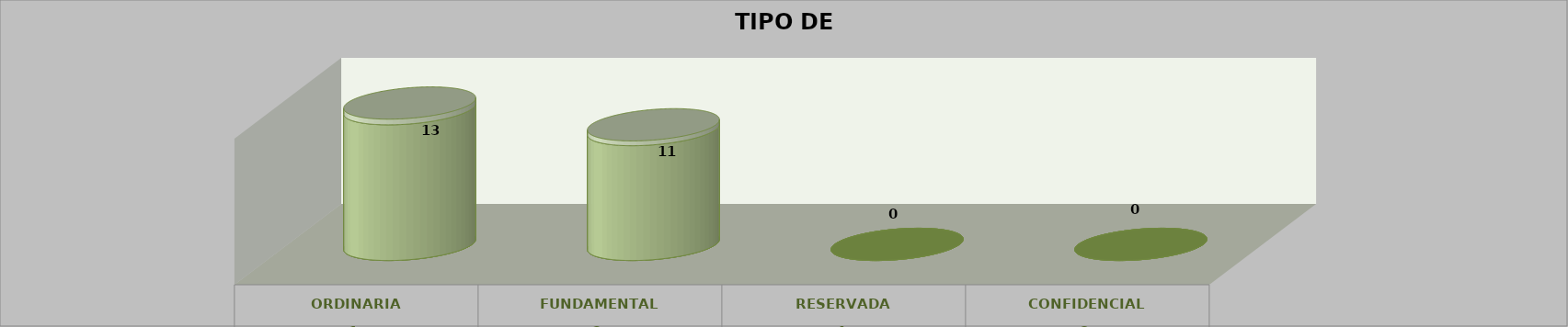
| Category | Series 0 | Series 2 | Series 1 | Series 3 | Series 4 |
|---|---|---|---|---|---|
| 0 |  |  |  | 13 | 0.542 |
| 1 |  |  |  | 11 | 0.458 |
| 2 |  |  |  | 0 | 0 |
| 3 |  |  |  | 0 | 0 |